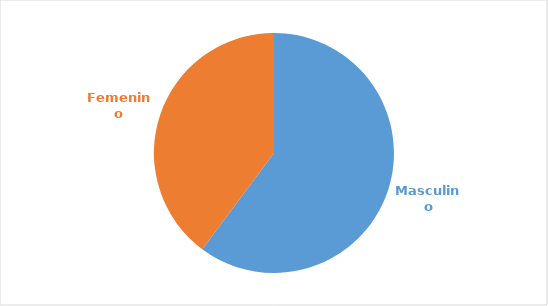
| Category | Series 0 |
|---|---|
| Masculino | 0.602 |
| Femenino | 0.398 |